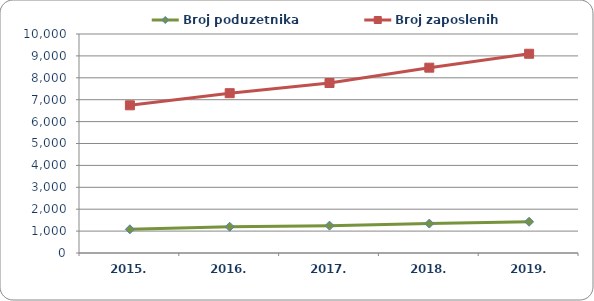
| Category | Broj poduzetnika  | Broj zaposlenih  |
|---|---|---|
| 2015. | 1081 | 6744 |
| 2016. | 1198 | 7297 |
| 2017. | 1249 | 7762 |
| 2018. | 1343 | 8462 |
| 2019. | 1427 | 9098 |